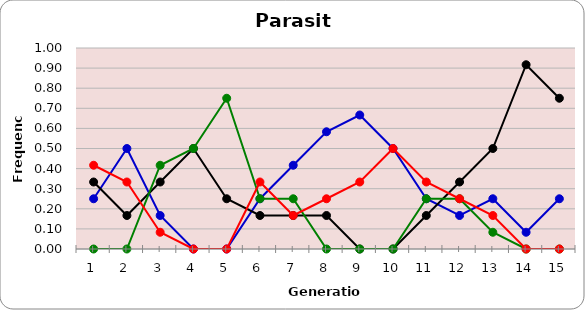
| Category | Sp | Cl | Di | He |
|---|---|---|---|---|
| 1.0 | 0.25 | 0.333 | 0 | 0.417 |
| 2.0 | 0.5 | 0.167 | 0 | 0.333 |
| 3.0 | 0.167 | 0.333 | 0.417 | 0.083 |
| 4.0 | 0 | 0.5 | 0.5 | 0 |
| 5.0 | 0 | 0.25 | 0.75 | 0 |
| 6.0 | 0.25 | 0.167 | 0.25 | 0.333 |
| 7.0 | 0.417 | 0.167 | 0.25 | 0.167 |
| 8.0 | 0.583 | 0.167 | 0 | 0.25 |
| 9.0 | 0.667 | 0 | 0 | 0.333 |
| 10.0 | 0.5 | 0 | 0 | 0.5 |
| 11.0 | 0.25 | 0.167 | 0.25 | 0.333 |
| 12.0 | 0.167 | 0.333 | 0.25 | 0.25 |
| 13.0 | 0.25 | 0.5 | 0.083 | 0.167 |
| 14.0 | 0.083 | 0.917 | 0 | 0 |
| 15.0 | 0.25 | 0.75 | 0 | 0 |